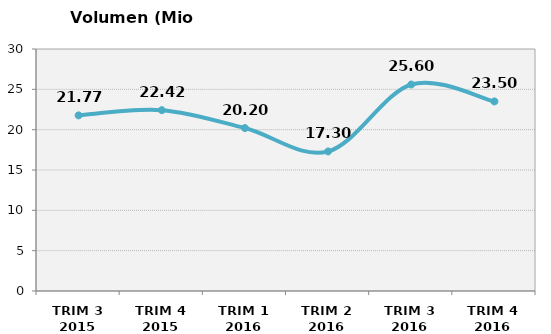
| Category | Volumen (Mio consumiciones) |
|---|---|
| TRIM 3 2015 | 21.773 |
| TRIM 4 2015 | 22.418 |
| TRIM 1 2016 | 20.2 |
| TRIM 2 2016 | 17.3 |
| TRIM 3 2016 | 25.6 |
| TRIM 4 2016 | 23.5 |